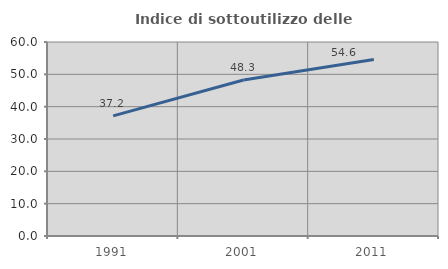
| Category | Indice di sottoutilizzo delle abitazioni  |
|---|---|
| 1991.0 | 37.163 |
| 2001.0 | 48.263 |
| 2011.0 | 54.599 |